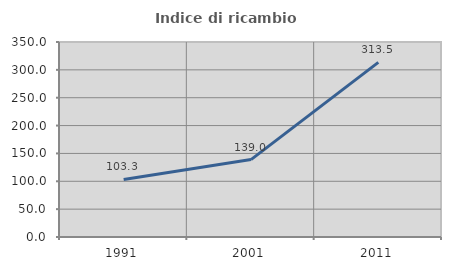
| Category | Indice di ricambio occupazionale  |
|---|---|
| 1991.0 | 103.337 |
| 2001.0 | 138.961 |
| 2011.0 | 313.496 |